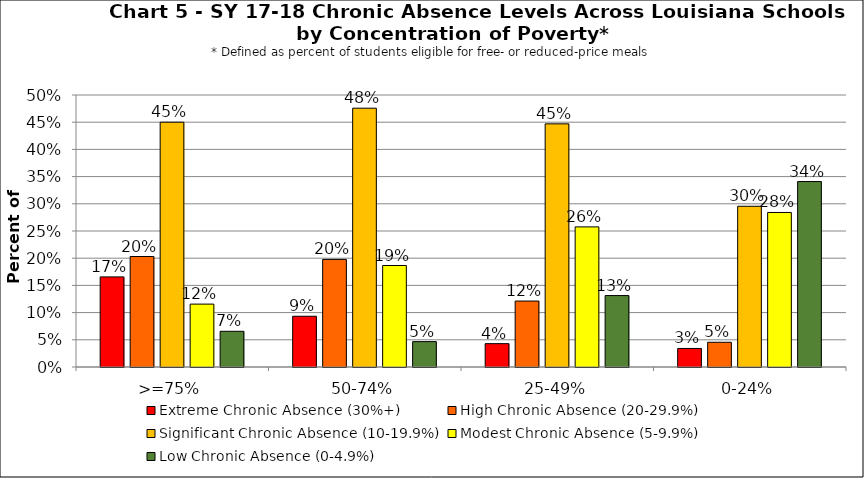
| Category | Extreme Chronic Absence (30%+) | High Chronic Absence (20-29.9%) | Significant Chronic Absence (10-19.9%) | Modest Chronic Absence (5-9.9%) | Low Chronic Absence (0-4.9%) |
|---|---|---|---|---|---|
| 0 | 0.166 | 0.203 | 0.45 | 0.116 | 0.066 |
| 1 | 0.093 | 0.198 | 0.476 | 0.187 | 0.047 |
| 2 | 0.043 | 0.121 | 0.447 | 0.258 | 0.131 |
| 3 | 0.034 | 0.045 | 0.295 | 0.284 | 0.341 |